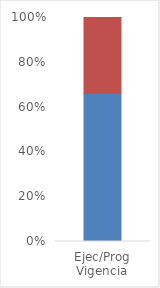
| Category | Series 0 | Series 1 |
|---|---|---|
| Ejec/Prog
Vigencia | 1.005 | 0.515 |